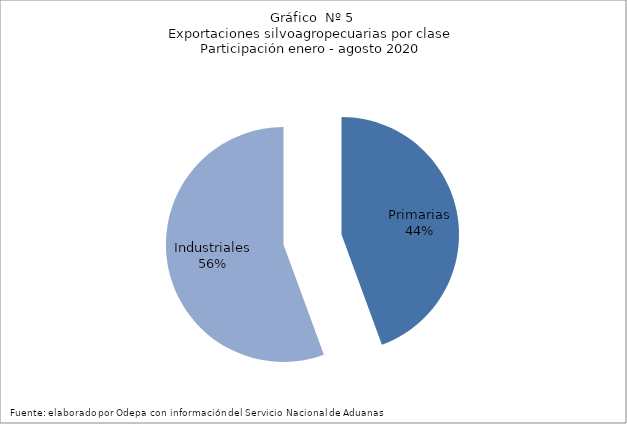
| Category | Series 0 |
|---|---|
| Primarias | 4838410 |
| Industriales | 6056176 |